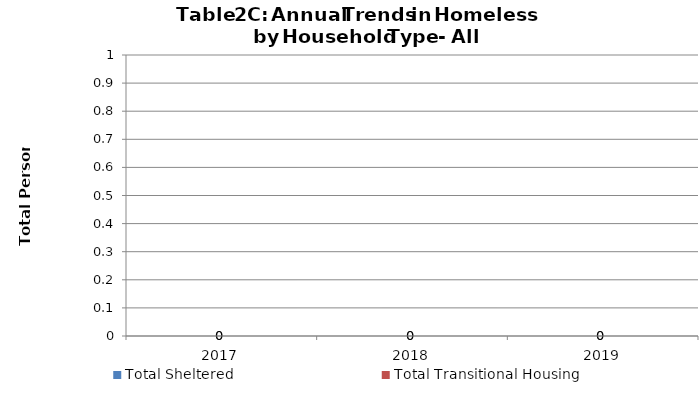
| Category | Total Sheltered | Total Transitional Housing |
|---|---|---|
| 2017.0 | 0 | 0 |
| 2018.0 | 0 | 0 |
| 2019.0 | 0 | 0 |